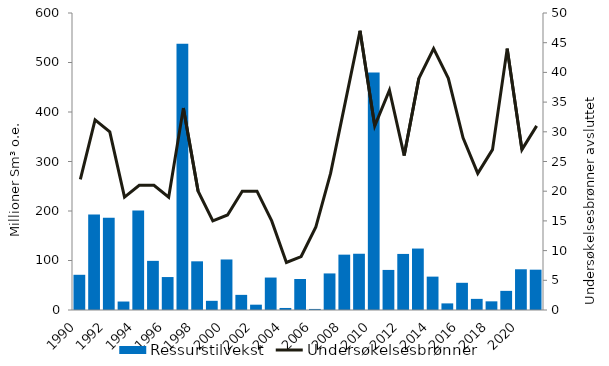
| Category | Ressurstilvekst |
|---|---|
| 1990.0 | 71.13 |
| 1991.0 | 193.12 |
| 1992.0 | 186.59 |
| 1993.0 | 17.12 |
| 1994.0 | 200.8 |
| 1995.0 | 99.29 |
| 1996.0 | 66.57 |
| 1997.0 | 537.95 |
| 1998.0 | 98.35 |
| 1999.0 | 18.55 |
| 2000.0 | 102.07 |
| 2001.0 | 30.58 |
| 2002.0 | 10.74 |
| 2003.0 | 65.56 |
| 2004.0 | 4.11 |
| 2005.0 | 62.58 |
| 2006.0 | 2.13 |
| 2007.0 | 73.88 |
| 2008.0 | 111.82 |
| 2009.0 | 113.65 |
| 2010.0 | 479.55 |
| 2011.0 | 80.97 |
| 2012.0 | 113.28 |
| 2013.0 | 124.14 |
| 2014.0 | 67.43 |
| 2015.0 | 13.35 |
| 2016.0 | 54.95 |
| 2017.0 | 22.48 |
| 2018.0 | 17.5 |
| 2019.0 | 38.65 |
| 2020.0 | 82.27 |
| 2021.0 | 81.45 |